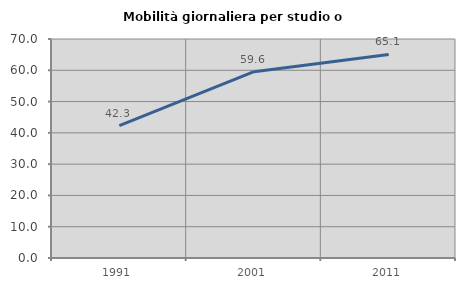
| Category | Mobilità giornaliera per studio o lavoro |
|---|---|
| 1991.0 | 42.304 |
| 2001.0 | 59.562 |
| 2011.0 | 65.052 |